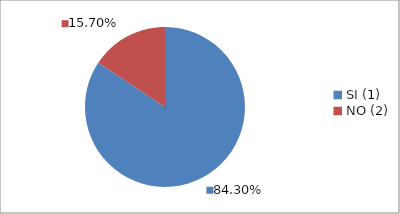
| Category | Series 0 |
|---|---|
| SI (1) | 0.843 |
| NO (2) | 0.157 |